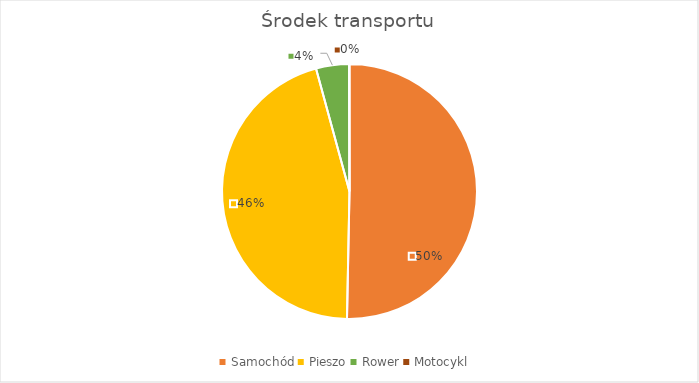
| Category | Series 0 |
|---|---|
| Samochód | 880 |
| Pieszo | 795 |
| Rower | 73 |
| Motocykl | 1 |